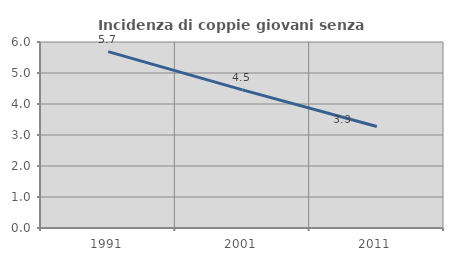
| Category | Incidenza di coppie giovani senza figli |
|---|---|
| 1991.0 | 5.691 |
| 2001.0 | 4.457 |
| 2011.0 | 3.274 |